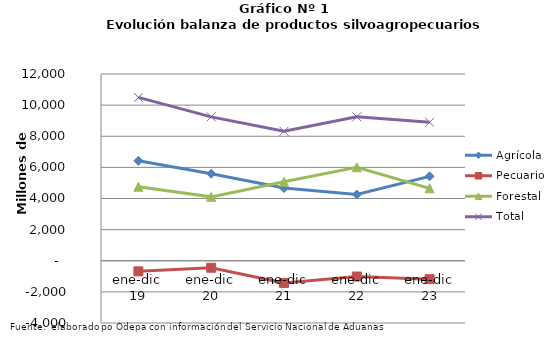
| Category | Agrícola | Pecuario | Forestal | Total |
|---|---|---|---|---|
| ene-dic 19 | 6422120 | -681646 | 4755333 | 10495807 |
| ene-dic 20 | 5590965 | -450130 | 4105622 | 9246457 |
| ene-dic 21 | 4670677 | -1424834 | 5074644 | 8320487 |
| ene-dic 22 | 4257611 | -1013499 | 6006164 | 9250276 |
| ene-dic 23 | 5423578 | -1183013 | 4654221 | 8894786 |